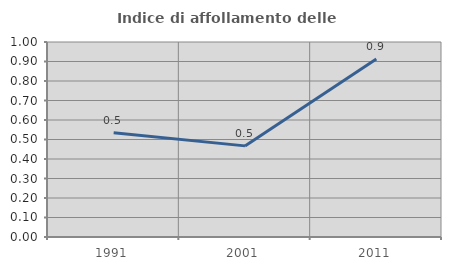
| Category | Indice di affollamento delle abitazioni  |
|---|---|
| 1991.0 | 0.535 |
| 2001.0 | 0.467 |
| 2011.0 | 0.913 |